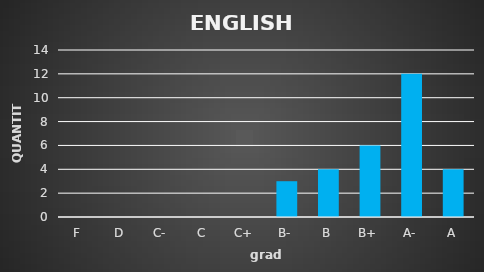
| Category | Series 0 |
|---|---|
| F | 0 |
| D | 0 |
| C- | 0 |
| C | 0 |
| C+ | 0 |
| B- | 3 |
| B | 4 |
| B+ | 6 |
| A- | 12 |
| A | 4 |